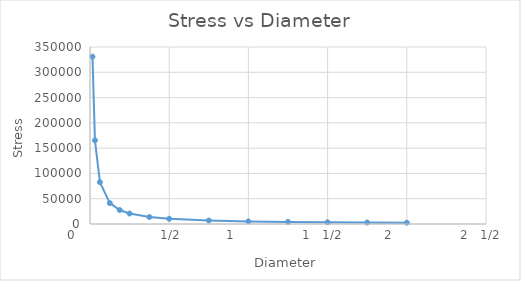
| Category | Series 0 |
|---|---|
| 2.0 | 2586.025 |
| 1.75 | 2955.457 |
| 1.5 | 3448.033 |
| 1.25 | 4137.639 |
| 1.0 | 5172.049 |
| 0.75 | 6896.065 |
| 0.5 | 10344.098 |
| 0.375 | 13792.131 |
| 0.25 | 20688.196 |
| 0.1875 | 27584.262 |
| 0.125 | 41376.392 |
| 0.0625 | 82752.785 |
| 0.03125 | 165505.569 |
| 0.015625 | 331011.139 |